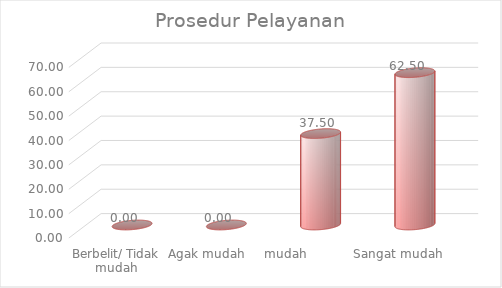
| Category | Prosedur Pelayanan |
|---|---|
| Berbelit/ Tidak mudah | 0 |
| Agak mudah  | 0 |
| mudah          | 37.5 |
| Sangat mudah | 62.5 |